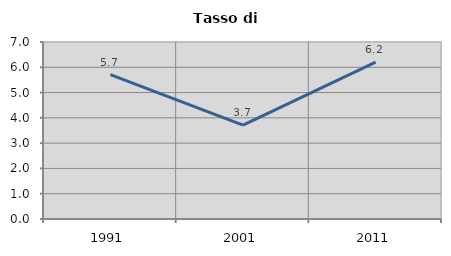
| Category | Tasso di disoccupazione   |
|---|---|
| 1991.0 | 5.709 |
| 2001.0 | 3.713 |
| 2011.0 | 6.208 |